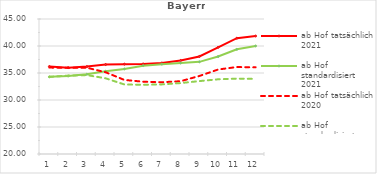
| Category | ab Hof tatsächlich 2021 | ab Hof standardisiert 2021 | ab Hof tatsächlich 2020 | ab Hof standardisiert 2020 |
|---|---|---|---|---|
| 0 | 36.201 | 34.286 | 36.001 | 34.283 |
| 1 | 35.994 | 34.437 | 35.96 | 34.517 |
| 2 | 36.189 | 34.77 | 35.979 | 34.613 |
| 3 | 36.566 | 35.324 | 35.139 | 34.019 |
| 4 | 36.638 | 35.751 | 33.715 | 32.874 |
| 5 | 36.688 | 36.357 | 33.387 | 32.812 |
| 6 | 36.857 | 36.639 | 33.292 | 32.889 |
| 7 | 37.322 | 36.836 | 33.483 | 33.135 |
| 8 | 38.067 | 37.067 | 34.45 | 33.501 |
| 9 | 39.755 | 38.048 | 35.646 | 33.835 |
| 10 | 41.443 | 39.383 | 36.105 | 33.955 |
| 11 | 41.845 | 40.006 | 36.045 | 33.91 |